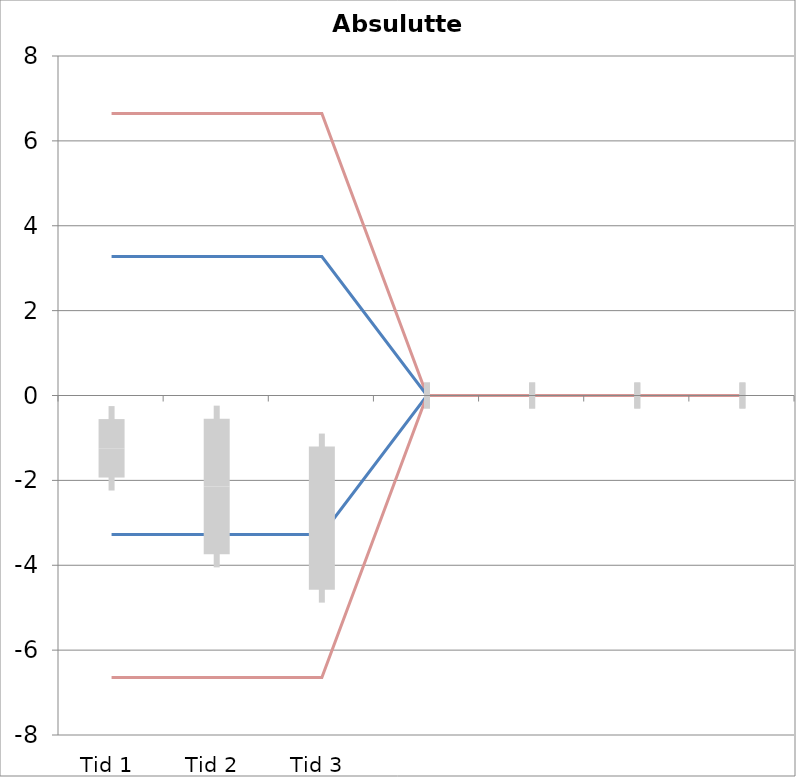
| Category | 1 | 2 | 3 | 4 | 5 | 6 | 7 | 8 | 9 | 10 | 11 | 12 | 13 | 14 | 15 | 16 | 17 | 18 | 19 | 20 | TEa | B | -B | -TEa | M |
|---|---|---|---|---|---|---|---|---|---|---|---|---|---|---|---|---|---|---|---|---|---|---|---|---|---|
| Tid 1 | -1.3 | -2.4 | -1.3 | -3 | -0.4 | -0.8 | -0.6 | -0.9 | -0.5 | 0 | 0 | 0 | 0 | 0 | 0 | 0 | 0 | 0 | 0 | 0 | 6.647 | 3.273 | -3.273 | -6.647 | -1.244 |
| Tid 2 | -0.9 | -5.8 | -1.6 | -5.5 | -0.9 | -1.1 | 0 | -1.2 | -2.3 | 0 | 0 | 0 | 0 | 0 | 0 | 0 | 0 | 0 | 0 | 0 | 6.647 | 3.273 | -3.273 | -6.647 | -2.144 |
| Tid 3 | -2.5 | -6.2 | -2.6 | -6.7 | -2.3 | -1.7 | -0.4 | -2.9 | -0.7 | 0 | 0 | 0 | 0 | 0 | 0 | 0 | 0 | 0 | 0 | 0 | 6.647 | 3.273 | -3.273 | -6.647 | -2.889 |